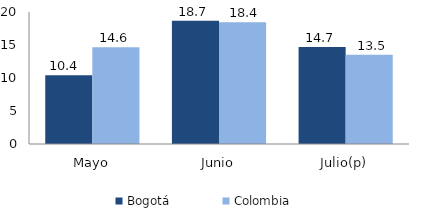
| Category | Bogotá | Colombia |
|---|---|---|
| Mayo | 10.436 | 14.645 |
| Junio | 18.672 | 18.431 |
| Julio(p) | 14.682 | 13.508 |